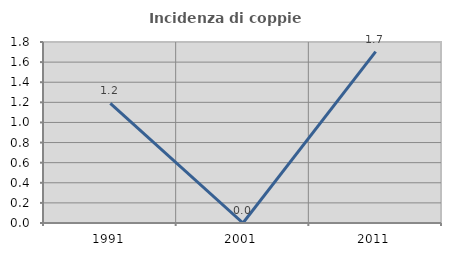
| Category | Incidenza di coppie miste |
|---|---|
| 1991.0 | 1.19 |
| 2001.0 | 0 |
| 2011.0 | 1.705 |